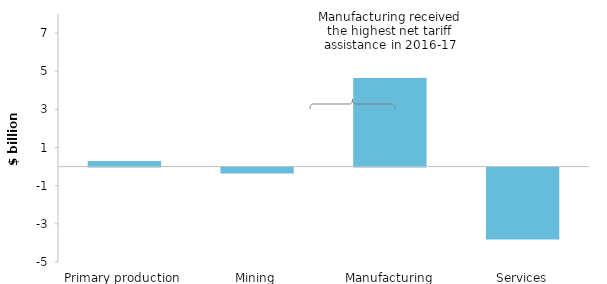
| Category | Net tariff assistance  |
|---|---|
| Primary production | 0.291 |
| Mining | -0.308 |
| Manufacturing | 4.649 |
| Services | -3.768 |